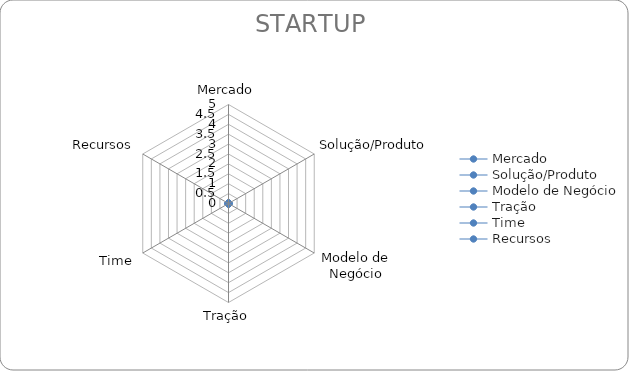
| Category | STARTUP |
|---|---|
| Mercado | 0 |
| Solução/Produto | 0 |
| Modelo de Negócio | 0 |
| Tração | 0 |
| Time | 0 |
| Recursos | 0 |